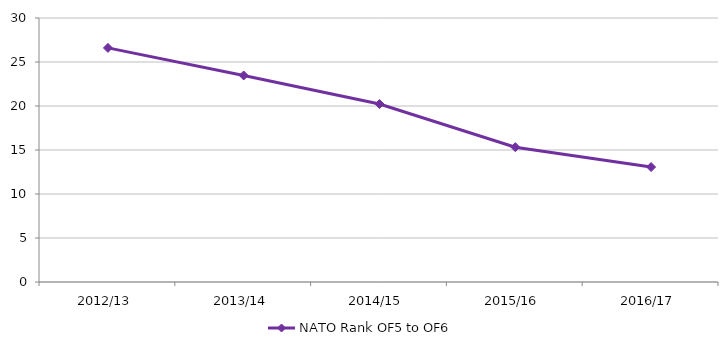
| Category | NATO Rank OF5 to OF6 |
|---|---|
| 2012/13 | 26.602 |
| 2013/14 | 23.471 |
| 2014/15 | 20.221 |
| 2015/16 | 15.321 |
| 2016/17 | 13.06 |